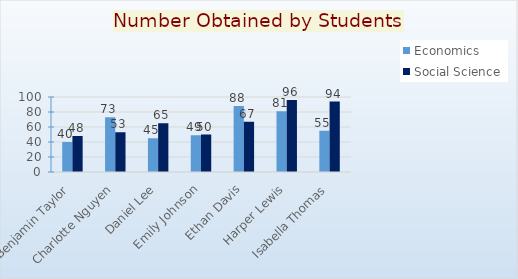
| Category | Economics | Social Science |
|---|---|---|
| Benjamin Taylor | 40 | 48 |
| Charlotte Nguyen | 73 | 53 |
| Daniel Lee | 45 | 65 |
| Emily Johnson | 49 | 50 |
| Ethan Davis | 88 | 67 |
| Harper Lewis | 81 | 96 |
| Isabella Thomas | 55 | 94 |